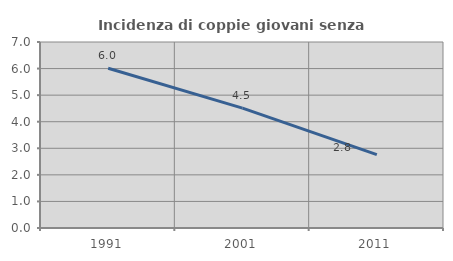
| Category | Incidenza di coppie giovani senza figli |
|---|---|
| 1991.0 | 6.011 |
| 2001.0 | 4.51 |
| 2011.0 | 2.763 |